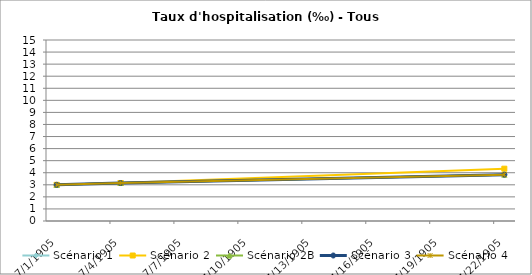
| Category | Scénario 1 | Scénario 2 | Scénario 2B | Scénario 3 | Scénario 4 |
|---|---|---|---|---|---|
| 2009.0 | 2.999 | 2.999 | 2.999 | 2.999 | 2.999 |
| 2012.0 | 3.148 | 3.148 | 3.148 | 3.148 | 3.148 |
| 2030.0 | 3.842 | 4.335 | 3.842 | 3.842 | 3.842 |